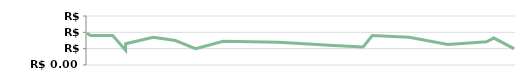
| Category | RECEITA |
|---|---|
| 2013-04-23 | 1950 |
| 2013-04-25 | 1800 |
| 2013-05-07 | 1800 |
| 2013-05-14 | 900 |
| 2013-05-14 | 1300 |
| 2013-05-29 | 1700 |
| 2013-06-10 | 1500 |
| 2013-06-21 | 1000 |
| 2013-07-06 | 1450 |
| 2013-08-05 | 1400 |
| 2013-08-19 | 1300 |
| 2013-09-04 | 1200 |
| 2013-09-20 | 1100 |
| 2013-09-25 | 1800 |
| 2013-10-15 | 1700 |
| 2013-11-05 | 1250 |
| 2013-11-26 | 1425 |
| 2013-11-30 | 1650 |
| 2013-12-11 | 1000 |